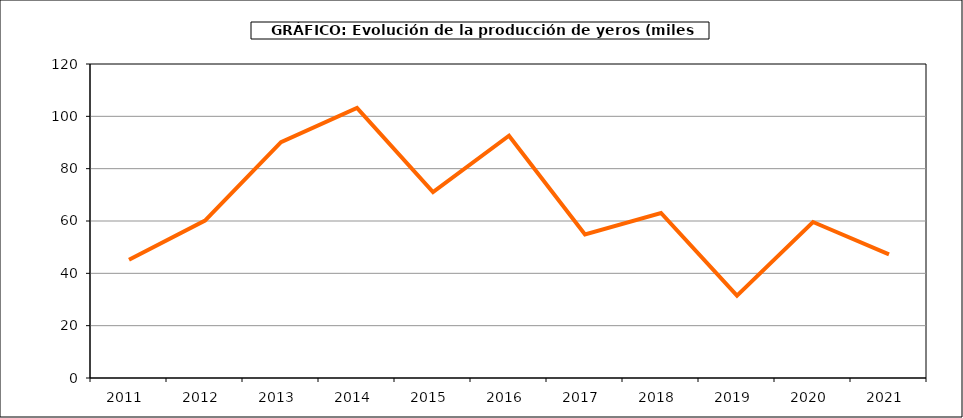
| Category | Producción |
|---|---|
| 2011.0 | 45.202 |
| 2012.0 | 60.147 |
| 2013.0 | 90.163 |
| 2014.0 | 103.242 |
| 2015.0 | 71.021 |
| 2016.0 | 92.587 |
| 2017.0 | 54.869 |
| 2018.0 | 63.055 |
| 2019.0 | 31.495 |
| 2020.0 | 59.609 |
| 2021.0 | 47.274 |